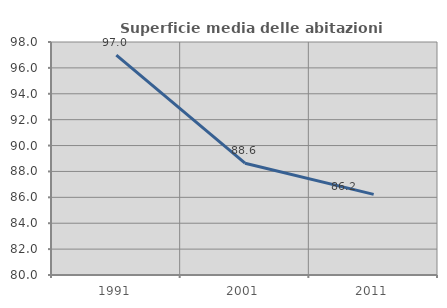
| Category | Superficie media delle abitazioni occupate |
|---|---|
| 1991.0 | 96.985 |
| 2001.0 | 88.638 |
| 2011.0 | 86.231 |